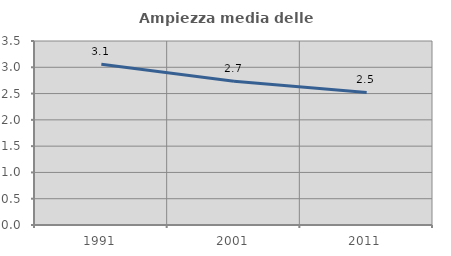
| Category | Ampiezza media delle famiglie |
|---|---|
| 1991.0 | 3.059 |
| 2001.0 | 2.732 |
| 2011.0 | 2.523 |